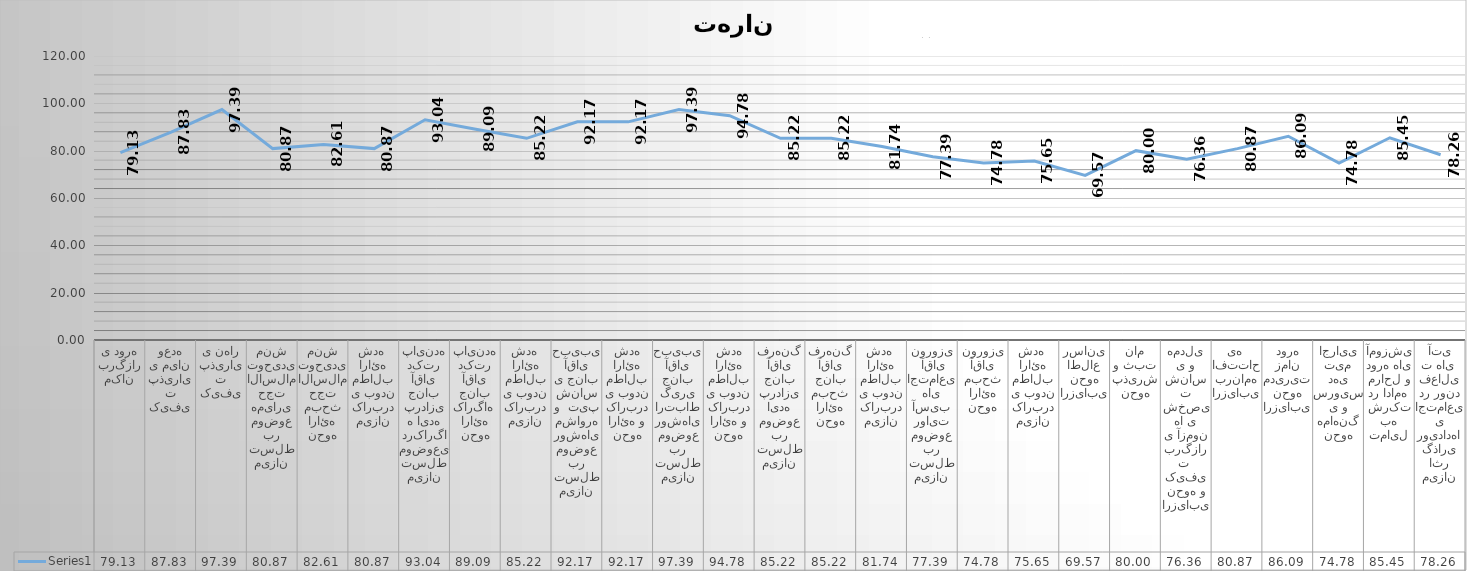
| Category | Series 0 |
|---|---|
| مکان برگزاری دوره | 79.13 |
| کیفیت پذیرایی میان وعده | 87.826 |
| کیفیت پذیرایی نهار | 97.391 |
| میزان تسلط بر موضوع همیاری حجت الاسلام توحیدی منش | 80.87 |
| نحوه ارائه مبحث حجت الاسلام توحیدی منش | 82.609 |
| میزان کاربردی بودن مطالب ارائه شده  | 80.87 |
| میزان تسلط موضوعی درکارگاه ایده پردازی جناب آقای دکتر پاینده | 93.043 |
| نحوه ارائه کارگاه  جناب آقای دکتر پاینده | 89.091 |
| میزان کاربردی بودن مطالب ارائه شده  | 85.217 |
| میزان تسلط بر موضوع روشهای مشاوره و  تیپ شناسی جناب آقای حبیبی | 92.174 |
| نحوه ارائه و کاربردی بودن مطالب ارائه شده | 92.174 |
| میزان تسلط بر موضوع روشهای ارتباط گیری جناب آقای حبیبی | 97.391 |
| نحوه ارائه و کاربردی بودن مطالب ارائه شده | 94.783 |
| میزان تسلط بر موضوع ایده پردازی جناب آقای فرهنگ | 85.217 |
| نحوه ارائه مبحث جناب آقای فرهنگ | 85.217 |
| میزان کاربردی بودن مطالب ارائه شده  | 81.739 |
| میزان تسلط بر موضوع روایت آسیب های اجتماعی  آقای نوروزی | 77.391 |
| نحوه ارائه مبحث آقای نوروزی | 74.783 |
| میزان کاربردی بودن مطالب ارائه شده  | 75.652 |
| ارزیابی نحوه اطلاع رسانی | 69.565 |
| نحوه پذیرش و ثبت نام | 80 |
| ارزیابی نحوه و کیفیت  برگزاری آزمون ها ی شخصیت شناسی و همدلی | 76.364 |
| ارزیابی برنامه افتتاحیه  | 80.87 |
| ارزیابی نحوه مدیریت زمان دوره | 86.087 |
| نحوه هماهنگی و سرویس دهی تیم اجرایی | 74.783 |
| تمایل به شرکت در ادامه مراحل و دوره های آموزشی | 85.455 |
| میزان اثر گذاری رویدادهای اجتماعی در روند فعالیت های  آتی | 78.261 |